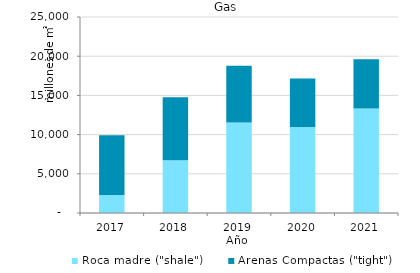
| Category | Roca madre ("shale") | Arenas Compactas ("tight") |
|---|---|---|
| 2017.0 | 2295.742 | 7630.925 |
| 2018.0 | 6734.305 | 8042.83 |
| 2019.0 | 11532.451 | 7265.05 |
| 2020.0 | 10970.027 | 6179.522 |
| 2021.0 | 13329.165 | 6289.631 |